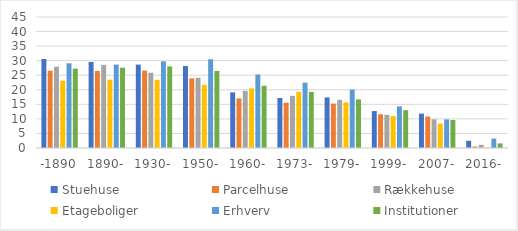
| Category | Stuehuse | Parcelhuse | Rækkehuse | Etageboliger | Erhverv | Institutioner |
|---|---|---|---|---|---|---|
| -1890 | 30.577 | 26.566 | 27.927 | 23.128 | 29.1 | 27.271 |
| 1890- | 29.554 | 26.447 | 28.556 | 23.461 | 28.649 | 27.582 |
| 1930- | 28.645 | 26.567 | 25.847 | 23.428 | 29.759 | 28.035 |
| 1950- | 28.165 | 23.908 | 24.095 | 21.675 | 30.492 | 26.455 |
| 1960- | 19.088 | 17.048 | 19.652 | 20.479 | 25.238 | 21.372 |
| 1973- | 17.181 | 15.546 | 17.922 | 19.276 | 22.43 | 19.264 |
| 1979- | 17.378 | 15.246 | 16.549 | 15.67 | 20.065 | 16.702 |
| 1999- | 12.692 | 11.601 | 11.399 | 10.942 | 14.305 | 12.995 |
| 2007- | 11.812 | 10.819 | 9.846 | 8.375 | 9.841 | 9.61 |
| 2016- | 2.484 | 0.508 | 1.099 | 0.252 | 3.236 | 1.569 |